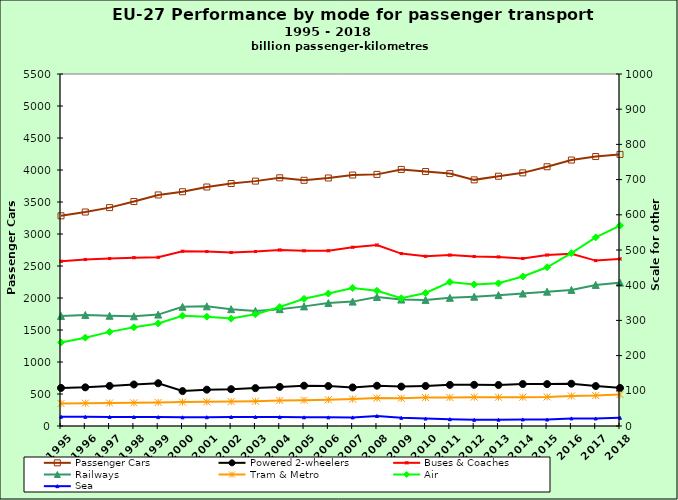
| Category | Passenger Cars |
|---|---|
| 1995.0 | 3283.764 |
| 1996.0 | 3343.401 |
| 1997.0 | 3412.199 |
| 1998.0 | 3507.134 |
| 1999.0 | 3610.558 |
| 2000.0 | 3660.355 |
| 2001.0 | 3734.216 |
| 2002.0 | 3789.305 |
| 2003.0 | 3826.196 |
| 2004.0 | 3878.163 |
| 2005.0 | 3839.179 |
| 2006.0 | 3875.261 |
| 2007.0 | 3921.256 |
| 2008.0 | 3931.624 |
| 2009.0 | 4009.212 |
| 2010.0 | 3975.851 |
| 2011.0 | 3943.643 |
| 2012.0 | 3845.907 |
| 2013.0 | 3902.695 |
| 2014.0 | 3955.512 |
| 2015.0 | 4051.186 |
| 2016.0 | 4155.613 |
| 2017.0 | 4210.237 |
| 2018.0 | 4243.819 |